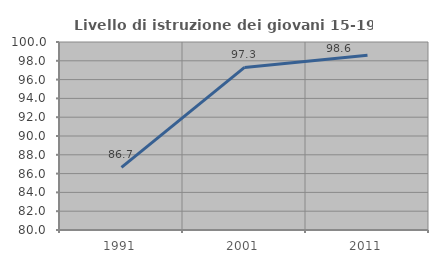
| Category | Livello di istruzione dei giovani 15-19 anni |
|---|---|
| 1991.0 | 86.667 |
| 2001.0 | 97.297 |
| 2011.0 | 98.592 |